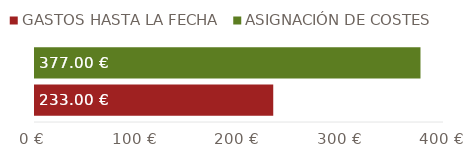
| Category | GASTOS HASTA LA FECHA | ASIGNACIÓN DE COSTES |
|---|---|---|
| TOTALES | 233 | 377 |